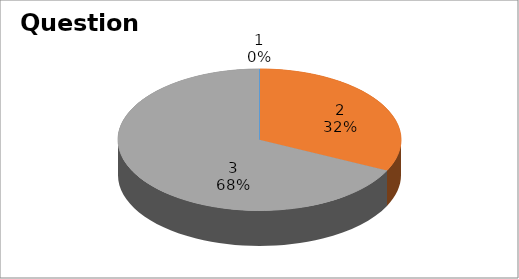
| Category | Series 0 |
|---|---|
| 0 | 0 |
| 1 | 9 |
| 2 | 19 |